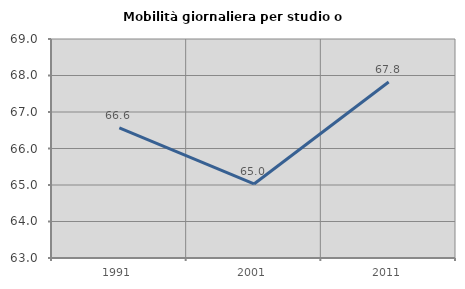
| Category | Mobilità giornaliera per studio o lavoro |
|---|---|
| 1991.0 | 66.565 |
| 2001.0 | 65.028 |
| 2011.0 | 67.823 |